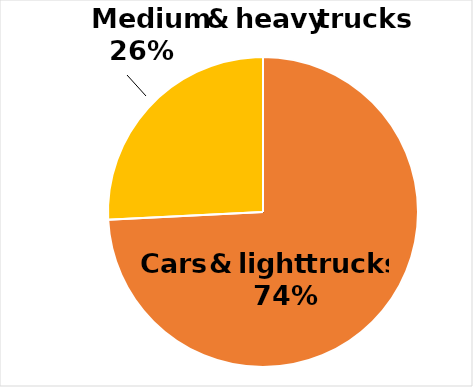
| Category | Series 0 |
|---|---|
| Cars | 126643777.647 |
| Med/Hvy Trucks | 44011521.405 |